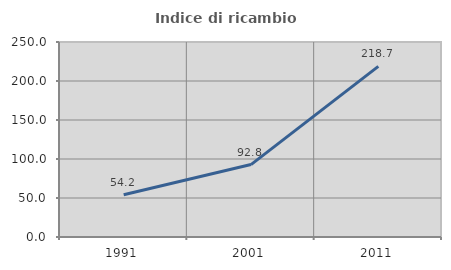
| Category | Indice di ricambio occupazionale  |
|---|---|
| 1991.0 | 54.213 |
| 2001.0 | 92.841 |
| 2011.0 | 218.739 |